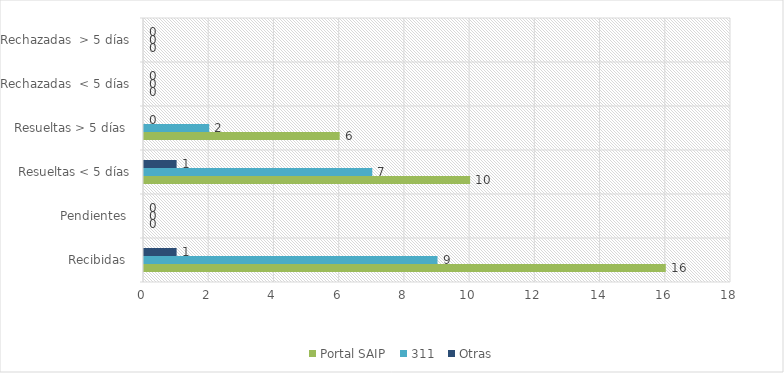
| Category | Portal SAIP | 311 | Otras |
|---|---|---|---|
| Recibidas  | 16 | 9 | 1 |
| Pendientes  | 0 | 0 | 0 |
| Resueltas < 5 días | 10 | 7 | 1 |
| Resueltas > 5 días  | 6 | 2 | 0 |
| Rechazadas  < 5 días | 0 | 0 | 0 |
| Rechazadas  > 5 días | 0 | 0 | 0 |